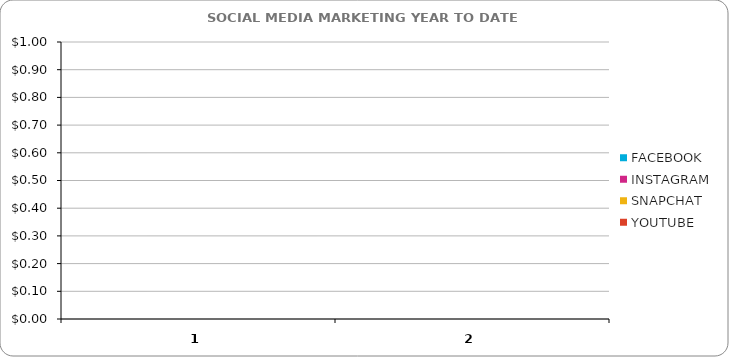
| Category | YOUTUBE | SNAPCHAT | INSTAGRAM | FACEBOOK |
|---|---|---|---|---|
| 0 | 0 | 0 | 0 | 0 |
| 1 | 0 | 0 | 0 | 0 |